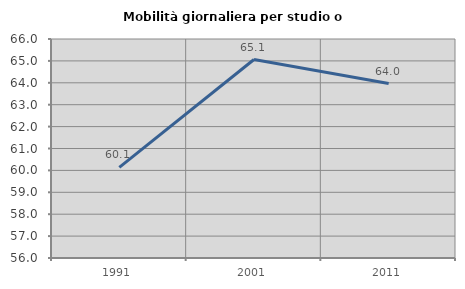
| Category | Mobilità giornaliera per studio o lavoro |
|---|---|
| 1991.0 | 60.135 |
| 2001.0 | 65.062 |
| 2011.0 | 63.965 |